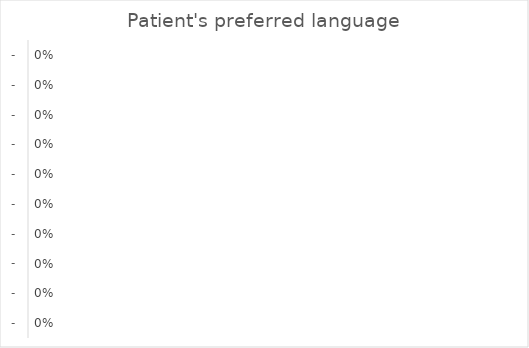
| Category | Series 0 |
|---|---|
| - | 0 |
| - | 0 |
| - | 0 |
| - | 0 |
| - | 0 |
| - | 0 |
| - | 0 |
| - | 0 |
| - | 0 |
| - | 0 |